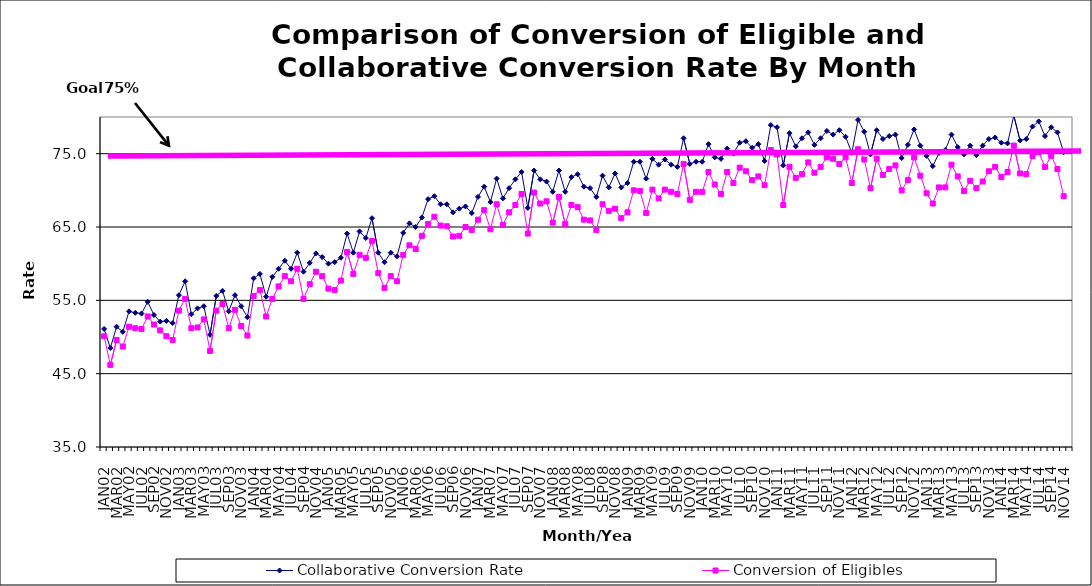
| Category | Collaborative Conversion Rate | Conversion of Eligibles |
|---|---|---|
| JAN02 | 51.1 | 50.1 |
| FEB02 | 48.5 | 46.2 |
| MAR02 | 51.4 | 49.6 |
| APR02 | 50.7 | 48.7 |
| MAY02 | 53.5 | 51.4 |
| JUN02 | 53.3 | 51.2 |
| JUL02 | 53.2 | 51.1 |
| AUG02 | 54.8 | 52.8 |
| SEP02 | 53 | 51.7 |
| OCT02 | 52.1 | 50.9 |
| NOV02 | 52.2 | 50.1 |
| DEC02 | 51.9 | 49.6 |
| JAN03 | 55.7 | 53.6 |
| FEB03 | 57.6 | 55.2 |
| MAR03 | 53.1 | 51.2 |
| APR03 | 53.9 | 51.3 |
| MAY03 | 54.2 | 52.4 |
| JUN03 | 50.3 | 48.1 |
| JUL03 | 55.6 | 53.6 |
| AUG03 | 56.3 | 54.5 |
| SEP03 | 53.5 | 51.2 |
| OCT03 | 55.7 | 53.7 |
| NOV03 | 54.2 | 51.5 |
| DEC03 | 52.7 | 50.2 |
| JAN04 | 58 | 55.6 |
| FEB04 | 58.6 | 56.4 |
| MAR04 | 55.5 | 52.8 |
| APR04 | 58.2 | 55.2 |
| MAY04 | 59.3 | 56.9 |
| JUN04 | 60.4 | 58.3 |
| JUL04 | 59.3 | 57.6 |
| AUG04 | 61.5 | 59.3 |
| SEP04 | 58.9 | 55.2 |
| OCT04 | 60.1 | 57.2 |
| NOV04 | 61.4 | 58.9 |
| DEC04 | 60.9 | 58.3 |
| JAN05 | 60 | 56.6 |
| FEB05 | 60.2 | 56.4 |
| MAR05 | 60.8 | 57.7 |
| APR05 | 64.1 | 61.6 |
| MAY05 | 61.5 | 58.6 |
| JUN05 | 64.4 | 61.2 |
| JUL05 | 63.5 | 60.8 |
| AUG05 | 66.2 | 63.1 |
| SEP05 | 61.5 | 58.7 |
| OCT05 | 60.2 | 56.7 |
| NOV05 | 61.5 | 58.3 |
| DEC05 | 61 | 57.6 |
| JAN06 | 64.2 | 61.2 |
| FEB06 | 65.5 | 62.5 |
| MAR06 | 65 | 62 |
| APR06 | 66.3 | 63.8 |
| MAY06 | 68.8 | 65.4 |
| JUN06 | 69.2 | 66.4 |
| JUL06 | 68.1 | 65.2 |
| AUG06 | 68.1 | 65.1 |
| SEP06 | 67 | 63.7 |
| OCT06 | 67.5 | 63.8 |
| NOV06 | 67.8 | 65 |
| DEC06 | 66.9 | 64.6 |
| JAN07 | 69.1 | 66 |
| FEB07 | 70.5 | 67.3 |
| MAR07 | 68.4 | 64.7 |
| APR07 | 71.6 | 68.1 |
| MAY07 | 68.9 | 65.3 |
| JUN07 | 70.3 | 67 |
| JUL07 | 71.5 | 68 |
| AUG07 | 72.5 | 69.5 |
| SEP07 | 67.6 | 64.1 |
| OCT07 | 72.7 | 69.7 |
| NOV07 | 71.5 | 68.2 |
| DEC07 | 71.2 | 68.5 |
| JAN08 | 69.8 | 65.6 |
| FEB08 | 72.7 | 69.1 |
| MAR08 | 69.8 | 65.4 |
| APR08 | 71.8 | 68 |
| MAY08 | 72.2 | 67.7 |
| JUN08 | 70.5 | 66 |
| JUL08 | 70.3 | 65.9 |
| AUG08 | 69.1 | 64.6 |
| SEP08 | 72 | 68.1 |
| OCT08 | 70.4 | 67.2 |
| NOV08 | 72.3 | 67.5 |
| DEC08 | 70.4 | 66.2 |
| JAN09 | 71 | 67 |
| FEB09 | 73.9 | 70 |
| MAR09 | 73.9 | 69.9 |
| APR09 | 71.6 | 66.9 |
| MAY09 | 74.3 | 70.1 |
| JUN09 | 73.5 | 68.9 |
| JUL09 | 74.2 | 70.1 |
| AUG09 | 73.5 | 69.8 |
| SEP09 | 73.2 | 69.5 |
| OCT09 | 77.1 | 73.6 |
| NOV09 | 73.6 | 68.7 |
| DEC09 | 73.9 | 69.8 |
| JAN10 | 73.9 | 69.8 |
| FEB10 | 76.3 | 72.5 |
| MAR10 | 74.5 | 70.8 |
| APR10 | 74.3 | 69.5 |
| MAY10 | 75.7 | 72.5 |
| JUN10 | 75 | 71 |
| JUL10 | 76.5 | 73.1 |
| AUG10 | 76.7 | 72.6 |
| SEP10 | 75.8 | 71.4 |
| OCT10 | 76.3 | 71.9 |
| NOV10 | 74 | 70.7 |
| DEC10 | 78.9 | 75.5 |
| JAN11 | 78.6 | 74.9 |
| FEB11 | 73.4 | 68 |
| MAR11 | 77.8 | 73.2 |
| APR11 | 76 | 71.7 |
| MAY11 | 77.1 | 72.2 |
| JUN11 | 77.9 | 73.8 |
| JUL11 | 76.2 | 72.4 |
| AUG11 | 77.1 | 73.2 |
| SEP11 | 78.1 | 74.5 |
| OCT11 | 77.6 | 74.3 |
| NOV11 | 78.2 | 73.6 |
| DEC11 | 77.3 | 74.5 |
| JAN12 | 75.1 | 71 |
| FEB12 | 79.6 | 75.6 |
| MAR12 | 78 | 74.2 |
| APR12 | 74.9 | 70.3 |
| MAY12 | 78.2 | 74.3 |
| JUN12 | 77 | 72.1 |
| JUL12 | 77.4 | 72.9 |
| AUG12 | 77.6 | 73.4 |
| SEP12 | 74.4 | 70 |
| OCT12 | 76.2 | 71.4 |
| NOV12 | 78.3 | 74.5 |
| DEC12 | 76.1 | 72 |
| JAN13 | 74.7 | 69.6 |
| FEB13 | 73.3 | 68.2 |
| MAR13 | 75.1 | 70.4 |
| APR13 | 75.5 | 70.4 |
| MAY13 | 77.6 | 73.5 |
| JUN13 | 75.9 | 71.9 |
| JUL13 | 74.9 | 69.9 |
| AUG13 | 76.1 | 71.3 |
| SEP13 | 74.8 | 70.3 |
| OCT13 | 76.1 | 71.2 |
| NOV13 | 77 | 72.6 |
| DEC13 | 77.2 | 73.2 |
| JAN14 | 76.5 | 71.8 |
| FEB14 | 76.4 | 72.5 |
| MAR14 | 80.2 | 76.1 |
| APR14 | 76.8 | 72.3 |
| MAY14 | 77 | 72.2 |
| JUN14 | 78.7 | 74.7 |
| JUL14 | 79.4 | 75.2 |
| AUG14 | 77.4 | 73.2 |
| SEP14 | 78.6 | 74.7 |
| OCT14 | 77.9 | 72.9 |
| NOV14 | 75.2 | 69.2 |